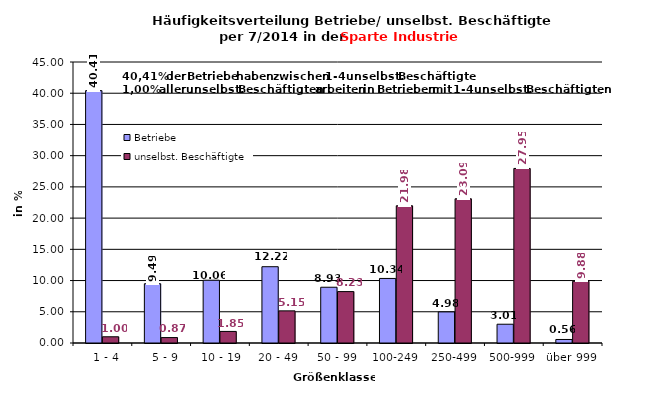
| Category | Betriebe | unselbst. Beschäftigte |
|---|---|---|
|   1 - 4 | 40.414 | 0.998 |
|   5 - 9 | 9.492 | 0.869 |
|  10 - 19 | 10.056 | 1.854 |
| 20 - 49 | 12.218 | 5.146 |
| 50 - 99 | 8.929 | 8.23 |
| 100-249 | 10.338 | 21.975 |
| 250-499 | 4.981 | 23.094 |
| 500-999 | 3.008 | 27.953 |
| über 999 | 0.564 | 9.881 |